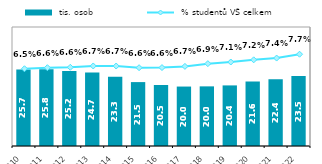
| Category |  tis. osob |
|---|---|
| 2010 | 25.709 |
| 2011 | 25.797 |
| 2012 | 25.198 |
| 2013 | 24.731 |
| 2014 | 23.306 |
| 2015 | 21.48 |
| 2016 | 20.499 |
| 2017 | 19.982 |
| 2018 | 20.045 |
| 2019 | 20.368 |
| 2020 | 21.647 |
| 2021 | 22.44 |
| 2022 | 23.488 |